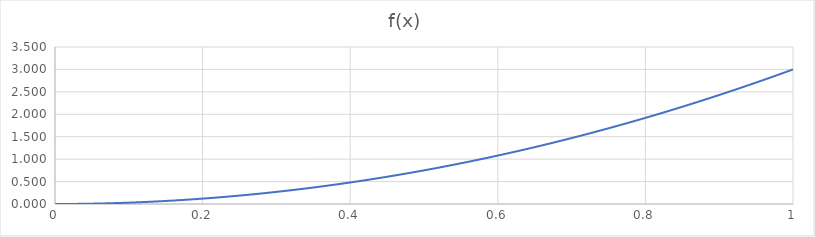
| Category | Series 0 |
|---|---|
| 0.0 | 0 |
| 0.01 | 0 |
| 0.02 | 0.001 |
| 0.03 | 0.003 |
| 0.04 | 0.005 |
| 0.05 | 0.008 |
| 0.06 | 0.011 |
| 0.07 | 0.015 |
| 0.08 | 0.019 |
| 0.09 | 0.024 |
| 0.1 | 0.03 |
| 0.11 | 0.036 |
| 0.12 | 0.043 |
| 0.13 | 0.051 |
| 0.14 | 0.059 |
| 0.15 | 0.068 |
| 0.16 | 0.077 |
| 0.17 | 0.087 |
| 0.18 | 0.097 |
| 0.19 | 0.108 |
| 0.2 | 0.12 |
| 0.21 | 0.132 |
| 0.22 | 0.145 |
| 0.23 | 0.159 |
| 0.24 | 0.173 |
| 0.25 | 0.188 |
| 0.26 | 0.203 |
| 0.27 | 0.219 |
| 0.28 | 0.235 |
| 0.29 | 0.252 |
| 0.3 | 0.27 |
| 0.31 | 0.288 |
| 0.32 | 0.307 |
| 0.33 | 0.327 |
| 0.34 | 0.347 |
| 0.35 | 0.367 |
| 0.36 | 0.389 |
| 0.37 | 0.411 |
| 0.38 | 0.433 |
| 0.39 | 0.456 |
| 0.4 | 0.48 |
| 0.41 | 0.504 |
| 0.42 | 0.529 |
| 0.43 | 0.555 |
| 0.44 | 0.581 |
| 0.45 | 0.608 |
| 0.46 | 0.635 |
| 0.47 | 0.663 |
| 0.48 | 0.691 |
| 0.49 | 0.72 |
| 0.5 | 0.75 |
| 0.51 | 0.78 |
| 0.52 | 0.811 |
| 0.53 | 0.843 |
| 0.54 | 0.875 |
| 0.55 | 0.908 |
| 0.56 | 0.941 |
| 0.57 | 0.975 |
| 0.58 | 1.009 |
| 0.59 | 1.044 |
| 0.6 | 1.08 |
| 0.61 | 1.116 |
| 0.62 | 1.153 |
| 0.63 | 1.191 |
| 0.64 | 1.229 |
| 0.65 | 1.268 |
| 0.66 | 1.307 |
| 0.67 | 1.347 |
| 0.68 | 1.387 |
| 0.69 | 1.428 |
| 0.7 | 1.47 |
| 0.71 | 1.512 |
| 0.72 | 1.555 |
| 0.73 | 1.599 |
| 0.74 | 1.643 |
| 0.75 | 1.688 |
| 0.76 | 1.733 |
| 0.77 | 1.779 |
| 0.78 | 1.825 |
| 0.79 | 1.872 |
| 0.8 | 1.92 |
| 0.81 | 1.968 |
| 0.82 | 2.017 |
| 0.83 | 2.067 |
| 0.84 | 2.117 |
| 0.85 | 2.167 |
| 0.86 | 2.219 |
| 0.87 | 2.271 |
| 0.88 | 2.323 |
| 0.89 | 2.376 |
| 0.9 | 2.43 |
| 0.91 | 2.484 |
| 0.92 | 2.539 |
| 0.93 | 2.595 |
| 0.94 | 2.651 |
| 0.95 | 2.708 |
| 0.96 | 2.765 |
| 0.97 | 2.823 |
| 0.98 | 2.881 |
| 0.99 | 2.94 |
| 1.0 | 3 |